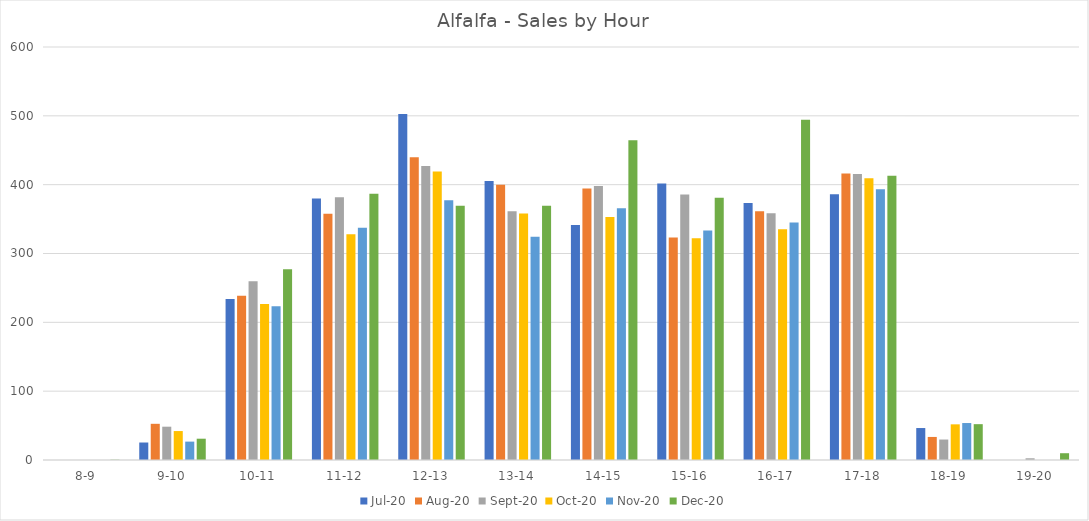
| Category | Jul-20 | Aug-20 | Sep-20 | Oct-20 | Nov-20 | Dec-20 |
|---|---|---|---|---|---|---|
| 8-9 | 0 | 0 | 0 | 0 | 0 | 0.378 |
| 9-10 | 25.405 | 52.576 | 48.384 | 42.053 | 26.709 | 30.941 |
| 10-11 | 234.011 | 238.563 | 259.767 | 226.496 | 223.223 | 277.243 |
| 11-12 | 379.965 | 357.806 | 381.827 | 328.053 | 337.261 | 386.688 |
| 12-13 | 502.672 | 439.864 | 427.224 | 419.309 | 377.257 | 369.461 |
| 13-14 | 405.159 | 399.906 | 361.396 | 358.083 | 324.218 | 369.311 |
| 14-15 | 341.479 | 394.349 | 398.023 | 353.112 | 365.722 | 464.493 |
| 15-16 | 401.874 | 323.11 | 385.716 | 321.993 | 333.552 | 381.139 |
| 16-17 | 373.492 | 361.528 | 358.318 | 335.296 | 345.152 | 494.456 |
| 17-18 | 385.937 | 416.215 | 415.662 | 409.443 | 393.228 | 413.089 |
| 18-19 | 46.439 | 33.496 | 29.723 | 51.816 | 53.708 | 52.066 |
| 19-20 | 0 | 0 | 2.502 | 0 | 0 | 9.855 |